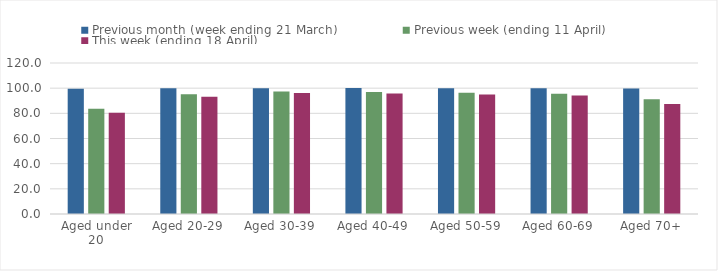
| Category | Previous month (week ending 21 March) | Previous week (ending 11 April) | This week (ending 18 April) |
|---|---|---|---|
| Aged under 20 | 99.511 | 83.654 | 80.423 |
| Aged 20-29 | 99.889 | 95.158 | 93.175 |
| Aged 30-39 | 99.988 | 97.386 | 96.196 |
| Aged 40-49 | 100.154 | 96.879 | 95.825 |
| Aged 50-59 | 99.95 | 96.273 | 94.99 |
| Aged 60-69 | 99.891 | 95.53 | 94.207 |
| Aged 70+ | 99.813 | 91.23 | 87.408 |